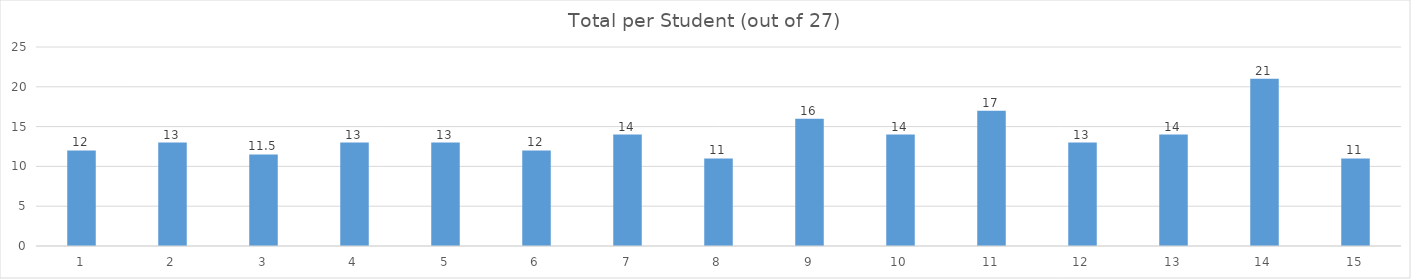
| Category | Total |
|---|---|
| 0 | 12 |
| 1 | 13 |
| 2 | 11.5 |
| 3 | 13 |
| 4 | 13 |
| 5 | 12 |
| 6 | 14 |
| 7 | 11 |
| 8 | 16 |
| 9 | 14 |
| 10 | 17 |
| 11 | 13 |
| 12 | 14 |
| 13 | 21 |
| 14 | 11 |